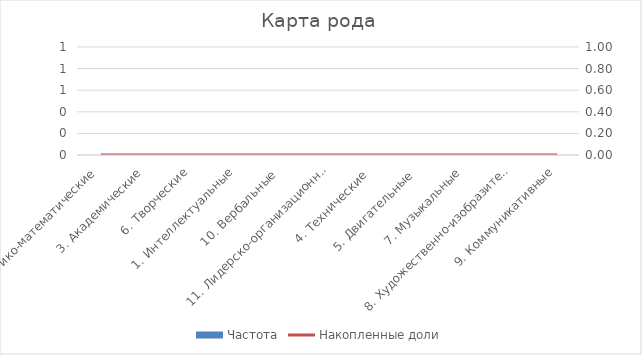
| Category | Частота |
|---|---|
| 2. Логико-математические | 0 |
| 3. Академические | 0 |
| 6. Творческие | 0 |
| 1. Интеллектуальные | 0 |
| 10. Вербальные  | 0 |
| 11. Лидерско-организационные | 0 |
| 4. Технические  | 0 |
| 5. Двигательные  | 0 |
| 7. Музыкальные | 0 |
| 8. Художественно-изобразительные | 0 |
| 9. Коммуникативные | 0 |